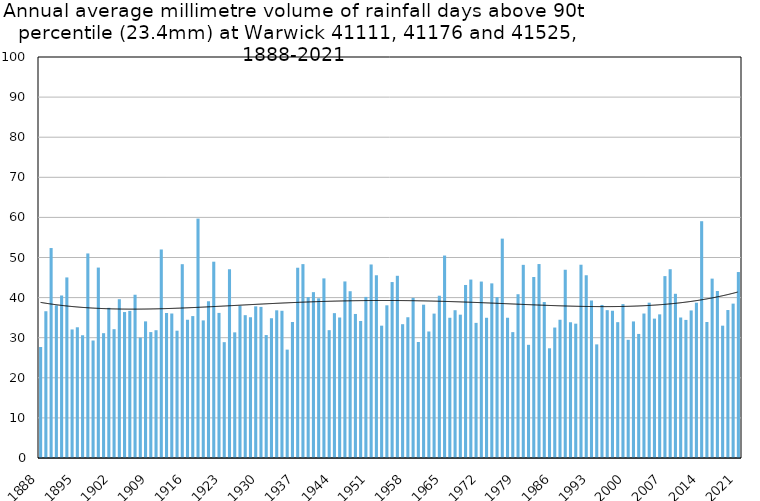
| Category | Annual average mm in days above 90th percentile |
|---|---|
| 1888 | 27.68 |
| 1889 | 36.6 |
| 1890 | 52.36 |
| 1891 | 38.067 |
| 1892 | 40.527 |
| 1893 | 45.03 |
| 1894 | 32.057 |
| 1895 | 32.6 |
| 1896 | 30.612 |
| 1897 | 51.012 |
| 1898 | 29.3 |
| 1899 | 47.488 |
| 1900 | 31.129 |
| 1901 | 37.45 |
| 1902 | 32.125 |
| 1903 | 39.6 |
| 1904 | 36.4 |
| 1905 | 36.686 |
| 1906 | 40.714 |
| 1907 | 30.017 |
| 1908 | 34.07 |
| 1909 | 31.4 |
| 1910 | 31.867 |
| 1911 | 52 |
| 1912 | 36.138 |
| 1913 | 36.033 |
| 1914 | 31.75 |
| 1915 | 48.333 |
| 1916 | 34.483 |
| 1917 | 35.391 |
| 1918 | 59.7 |
| 1919 | 34.312 |
| 1920 | 39.1 |
| 1921 | 48.955 |
| 1922 | 36.183 |
| 1923 | 28.886 |
| 1924 | 47.1 |
| 1925 | 31.333 |
| 1926 | 37.975 |
| 1927 | 35.62 |
| 1928 | 35.1 |
| 1929 | 37.82 |
| 1930 | 37.683 |
| 1931 | 30.657 |
| 1932 | 34.871 |
| 1933 | 36.83 |
| 1934 | 36.714 |
| 1935 | 27.029 |
| 1936 | 33.917 |
| 1937 | 47.45 |
| 1938 | 48.35 |
| 1939 | 40.122 |
| 1940 | 41.358 |
| 1941 | 39.825 |
| 1942 | 44.792 |
| 1943 | 31.88 |
| 1944 | 36.122 |
| 1945 | 35.036 |
| 1946 | 44.027 |
| 1947 | 41.591 |
| 1948 | 35.92 |
| 1949 | 34.173 |
| 1950 | 40.173 |
| 1951 | 48.26 |
| 1952 | 45.573 |
| 1953 | 33 |
| 1954 | 38.078 |
| 1955 | 43.88 |
| 1956 | 45.44 |
| 1957 | 33.367 |
| 1958 | 35.1 |
| 1959 | 39.933 |
| 1960 | 28.933 |
| 1961 | 38.233 |
| 1962 | 31.55 |
| 1963 | 36.009 |
| 1964 | 40.467 |
| 1965 | 50.488 |
| 1966 | 34.971 |
| 1967 | 36.855 |
| 1968 | 35.744 |
| 1969 | 43.15 |
| 1970 | 44.5 |
| 1971 | 33.7 |
| 1972 | 44 |
| 1973 | 34.97 |
| 1974 | 43.55 |
| 1975 | 40.122 |
| 1976 | 54.709 |
| 1977 | 34.95 |
| 1978 | 31.388 |
| 1979 | 40.843 |
| 1980 | 48.167 |
| 1981 | 28.225 |
| 1982 | 45.133 |
| 1983 | 48.367 |
| 1984 | 38.9 |
| 1985 | 27.36 |
| 1986 | 32.533 |
| 1987 | 34.48 |
| 1988 | 46.945 |
| 1989 | 33.867 |
| 1990 | 33.5 |
| 1991 | 48.2 |
| 1992 | 45.575 |
| 1993 | 39.3 |
| 1994 | 28.333 |
| 1995 | 38.167 |
| 1996 | 36.867 |
| 1997 | 36.714 |
| 1998 | 33.875 |
| 1999 | 38.375 |
| 2000 | 29.48 |
| 2001 | 34.056 |
| 2002 | 30.943 |
| 2003 | 36.029 |
| 2004 | 38.733 |
| 2005 | 34.76 |
| 2006 | 35.825 |
| 2007 | 45.36 |
| 2008 | 47.075 |
| 2009 | 40.95 |
| 2010 | 35.038 |
| 2011 | 34.436 |
| 2012 | 36.8 |
| 2013 | 38.727 |
| 2014 | 59.05 |
| 2015 | 33.922 |
| 2016 | 44.733 |
| 2017 | 41.65 |
| 2018 | 33 |
| 2019 | 36.9 |
| 2020 | 38.5 |
| 2021 | 46.371 |